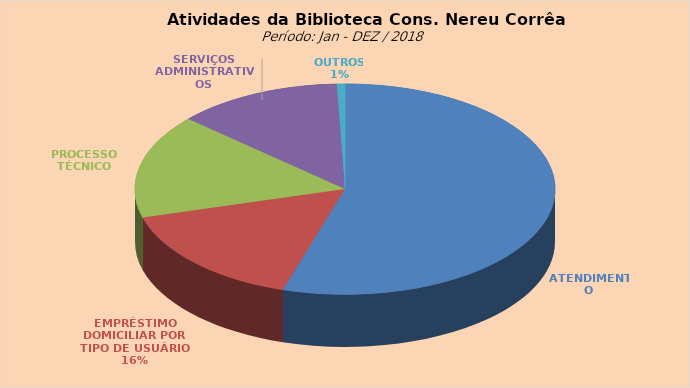
| Category | Series 0 |
|---|---|
| ATENDIMENTO | 14568 |
| EMPRÉSTIMO DOMICILIAR POR TIPO DE USUÁRIO | 4219 |
| PROCESSO TÉCNICO | 4251 |
| SERVIÇOS ADMINISTRATIVOS | 3394 |
| OUTROS | 166 |